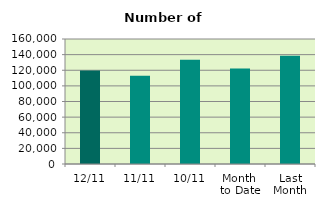
| Category | Series 0 |
|---|---|
| 12/11 | 119714 |
| 11/11 | 113076 |
| 10/11 | 133406 |
| Month 
to Date | 122174 |
| Last
Month | 138693.238 |